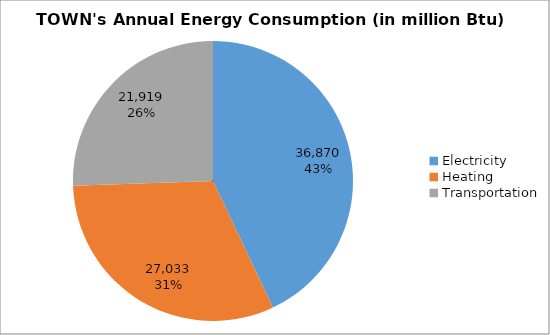
| Category | Series 0 |
|---|---|
| Electricity | 36870.349 |
| Heating | 27033.415 |
| Transportation | 21919.323 |